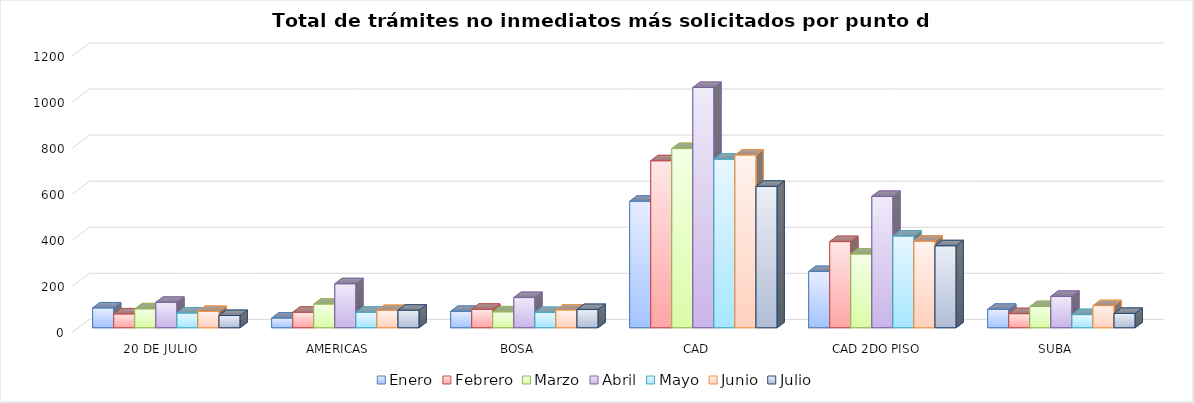
| Category | Enero | Febrero | Marzo | Abril | Mayo | Junio | Julio |
|---|---|---|---|---|---|---|---|
| 20 DE JULIO | 86 | 60 | 82 | 110 | 64 | 71 | 53 |
| AMERICAS | 42 | 67 | 103 | 191 | 67 | 75 | 76 |
| BOSA | 71 | 80 | 69 | 131 | 66 | 77 | 79 |
| CAD | 549 | 725 | 778 | 1043 | 732 | 750 | 614 |
| CAD 2DO PISO | 244 | 374 | 320 | 570 | 398 | 376 | 356 |
| SUBA | 80 | 61 | 92 | 136 | 57 | 96 | 62 |